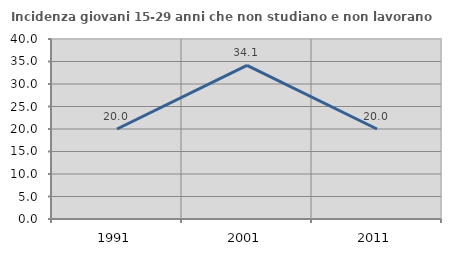
| Category | Incidenza giovani 15-29 anni che non studiano e non lavorano  |
|---|---|
| 1991.0 | 20 |
| 2001.0 | 34.146 |
| 2011.0 | 20 |